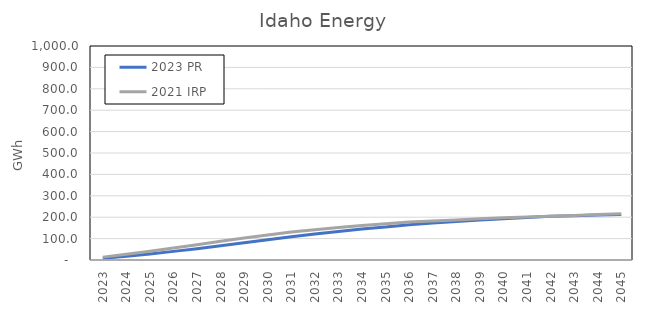
| Category | 2023 PR | 2021 IRP |
|---|---|---|
| 2023.0 | 8.151 | 13.4 |
| 2024.0 | 17.674 | 26.6 |
| 2025.0 | 28.586 | 40.9 |
| 2026.0 | 40.277 | 56 |
| 2027.0 | 52.977 | 71.6 |
| 2028.0 | 66.56 | 87.5 |
| 2029.0 | 80.622 | 102.6 |
| 2030.0 | 94.371 | 117.3 |
| 2031.0 | 108.316 | 130.7 |
| 2032.0 | 121.906 | 141.6 |
| 2033.0 | 133.692 | 152 |
| 2034.0 | 144.603 | 161.4 |
| 2035.0 | 154.729 | 169.8 |
| 2036.0 | 164.169 | 177.2 |
| 2037.0 | 172.968 | 182.6 |
| 2038.0 | 180.177 | 187.4 |
| 2039.0 | 186.891 | 192.4 |
| 2040.0 | 192.966 | 197.4 |
| 2041.0 | 198.688 | 201 |
| 2042.0 | 204.154 | 204.5 |
| 2043.0 | 207.039 | 208.3 |
| 2044.0 | 209.807 | 212.3 |
| 2045.0 | 212.071 | 215.6 |